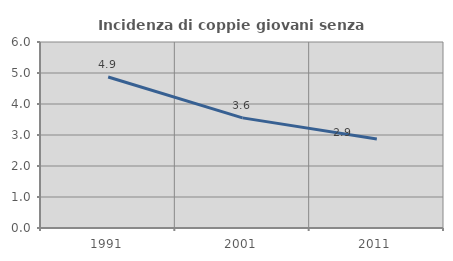
| Category | Incidenza di coppie giovani senza figli |
|---|---|
| 1991.0 | 4.87 |
| 2001.0 | 3.552 |
| 2011.0 | 2.869 |